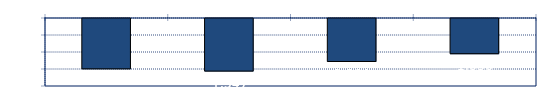
| Category | Series 0 |
|---|---|
| 0 | -1.481 |
| 1 | -1.547 |
| 2 | -1.264 |
| 3 | -1.036 |